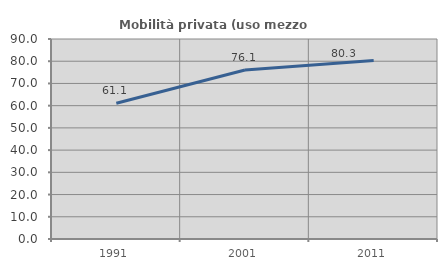
| Category | Mobilità privata (uso mezzo privato) |
|---|---|
| 1991.0 | 61.1 |
| 2001.0 | 76.077 |
| 2011.0 | 80.332 |